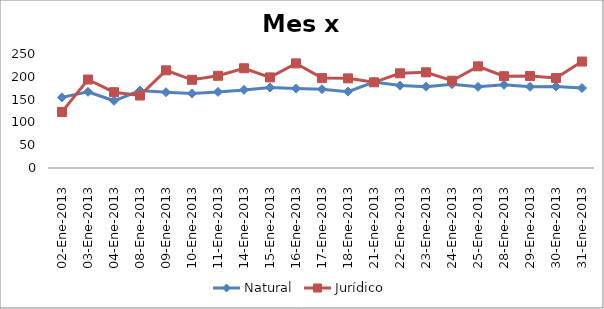
| Category | Natural | Jurídico |
|---|---|---|
| 02-Ene-2013 | 154.891 | 123 |
| 03-Ene-2013 | 167.055 | 194.032 |
| 04-Ene-2013 | 147.41 | 166.19 |
| 08-Ene-2013 | 169.876 | 158.984 |
| 09-Ene-2013 | 166.146 | 214.22 |
| 10-Ene-2013 | 163.461 | 193.429 |
| 11-Ene-2013 | 166.857 | 202.189 |
| 14-Ene-2013 | 171.27 | 218.701 |
| 15-Ene-2013 | 176.433 | 198.68 |
| 16-Ene-2013 | 174.174 | 229.469 |
| 17-Ene-2013 | 172.741 | 197.178 |
| 18-Ene-2013 | 167.492 | 196.581 |
| 21-Ene-2013 | 188.605 | 187.943 |
| 22-Ene-2013 | 180.765 | 207.66 |
| 23-Ene-2013 | 178.381 | 209.833 |
| 24-Ene-2013 | 183.711 | 191.4 |
| 25-Ene-2013 | 178.058 | 222.915 |
| 28-Ene-2013 | 182.298 | 201.266 |
| 29-Ene-2013 | 178.143 | 201.675 |
| 30-Ene-2013 | 178.554 | 197.462 |
| 31-Ene-2013 | 175.42 | 233.457 |